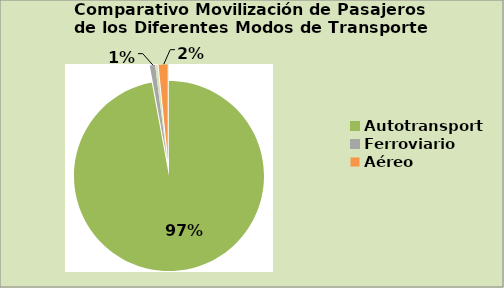
| Category | #REF! |
|---|---|
| Autotransporte | 97.1 |
| Ferroviario | 0.9 |
| Marítimo | 0.414 |
| Aéreo | 1.592 |